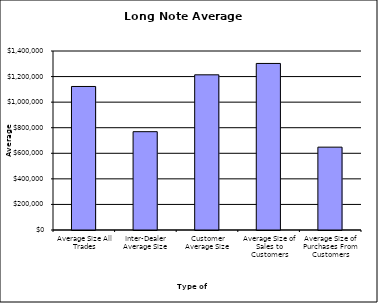
| Category | Security Type |
|---|---|
| Average Size All Trades | 1122530.031 |
| Inter-Dealer Average Size | 768963.929 |
| Customer Average Size | 1213708.829 |
| Average Size of Sales to Customers | 1302629.429 |
| Average Size of Purchases From Customers | 648010.008 |